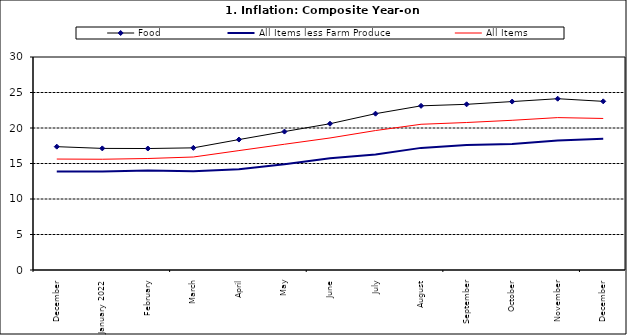
| Category | Food | All Items less Farm Produce | All Items |
|---|---|---|---|
| December | 17.37 | 13.873 | 15.625 |
| January 2022 | 17.126 | 13.869 | 15.601 |
| February | 17.11 | 14.011 | 15.702 |
| March | 17.203 | 13.914 | 15.915 |
| April | 18.371 | 14.178 | 16.819 |
| May | 19.496 | 14.897 | 17.712 |
| June | 20.603 | 15.747 | 18.596 |
| July | 22.017 | 16.258 | 19.643 |
| August | 23.121 | 17.2 | 20.525 |
| September | 23.336 | 17.601 | 20.774 |
| October | 23.723 | 17.759 | 21.087 |
| November | 24.125 | 18.244 | 21.466 |
| December | 23.754 | 18.492 | 21.344 |